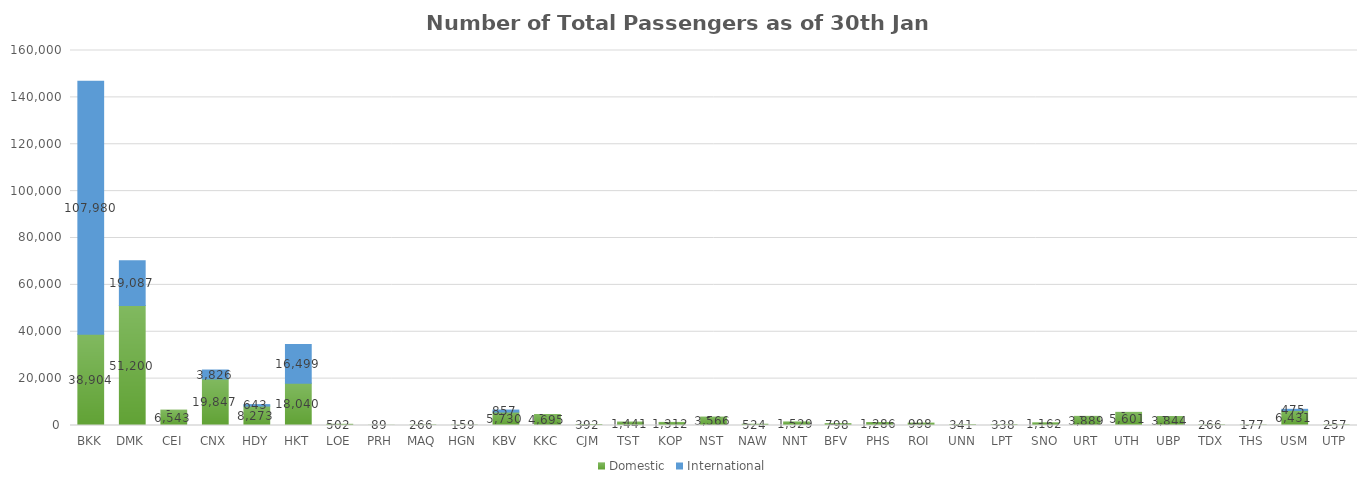
| Category | Domestic | International |
|---|---|---|
| BKK | 38904 | 107980 |
| DMK | 51200 | 19087 |
| CEI | 6543 | 0 |
| CNX | 19847 | 3826 |
| HDY | 8273 | 643 |
| HKT | 18040 | 16499 |
| LOE | 502 | 0 |
| PRH | 89 | 0 |
| MAQ | 266 | 0 |
| HGN | 159 | 0 |
| KBV | 5730 | 857 |
| KKC | 4695 | 0 |
| CJM | 392 | 0 |
| TST | 1441 | 0 |
| KOP | 1312 | 0 |
| NST | 3566 | 0 |
| NAW | 524 | 0 |
| NNT | 1529 | 0 |
| BFV | 798 | 0 |
| PHS | 1286 | 0 |
| ROI | 998 | 0 |
| UNN | 341 | 0 |
| LPT | 338 | 0 |
| SNO | 1162 | 0 |
| URT | 3889 | 0 |
| UTH | 5601 | 0 |
| UBP | 3844 | 0 |
| TDX | 266 | 0 |
| THS | 177 | 0 |
| USM | 6431 | 475 |
| UTP | 257 | 0 |